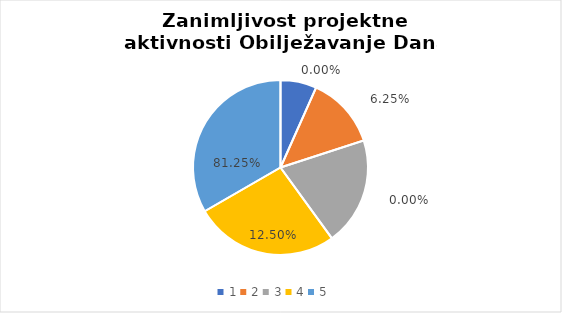
| Category | Series 0 | Series 1 |
|---|---|---|
| 0 | 1 | 0 |
| 1 | 2 | 0.062 |
| 2 | 3 | 0 |
| 3 | 4 | 0.125 |
| 4 | 5 | 0.812 |